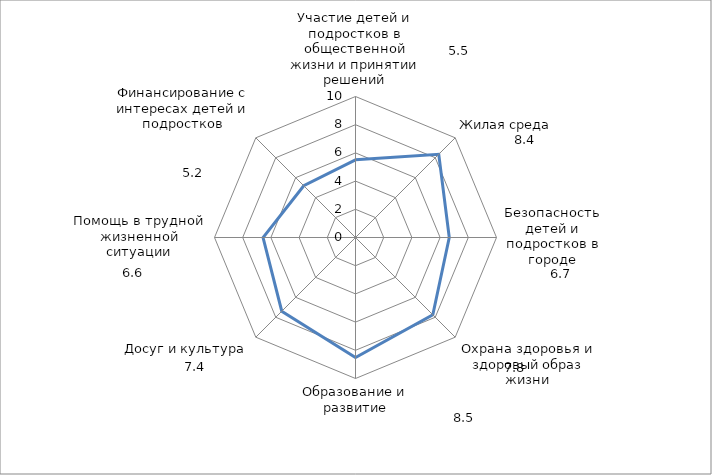
| Category | Нормированное значение параметра |
|---|---|
| Участие детей и подростков в общественной жизни и принятии решений | 5.509 |
| Жилая среда | 8.35 |
| Безопасность детей и подростков в городе | 6.65 |
| Охрана здоровья и здоровый образ жизни | 7.755 |
| Образование и развитие | 8.507 |
| Досуг и культура | 7.396 |
| Помощь в трудной жизненной ситуации | 6.556 |
| Финансирование с интересах детей и подростков | 5.188 |